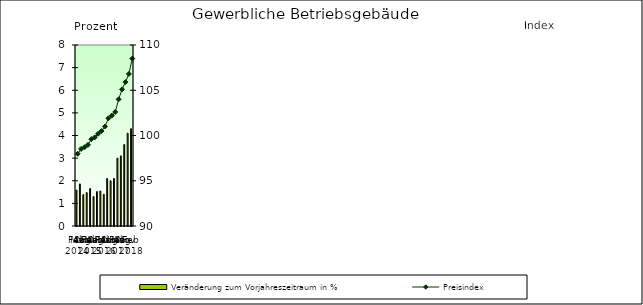
| Category | Veränderung zum Vorjahreszeitraum in % |
|---|---|
| 0 | 1.586 |
| 1 | 1.86 |
| 2 | 1.386 |
| 3 | 1.476 |
| 4 | 1.653 |
| 5 | 1.299 |
| 6 | 1.519 |
| 7 | 1.546 |
| 8 | 1.4 |
| 9 | 2.1 |
| 10 | 2 |
| 11 | 2.1 |
| 12 | 3 |
| 13 | 3.1 |
| 14 | 3.6 |
| 15 | 4.1 |
| 16 | 4.3 |